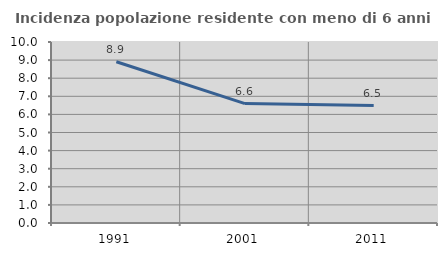
| Category | Incidenza popolazione residente con meno di 6 anni |
|---|---|
| 1991.0 | 8.91 |
| 2001.0 | 6.596 |
| 2011.0 | 6.487 |